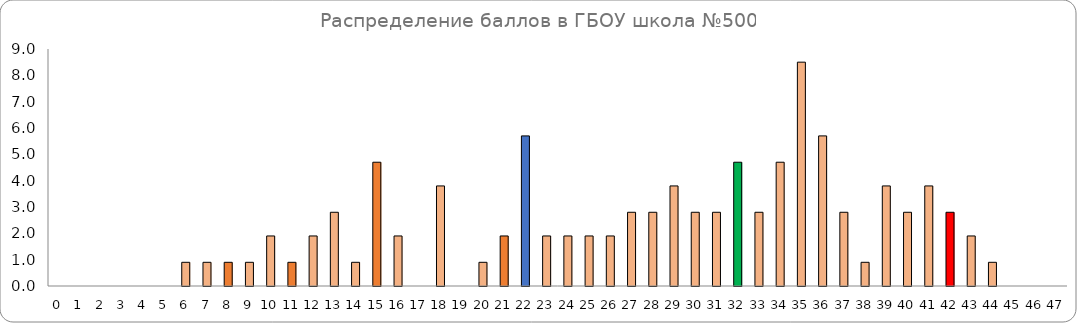
| Category | Series 0 |
|---|---|
| 0.0 | 0 |
| 1.0 | 0 |
| 2.0 | 0 |
| 3.0 | 0 |
| 4.0 | 0 |
| 5.0 | 0 |
| 6.0 | 0.9 |
| 7.0 | 0.9 |
| 8.0 | 0.9 |
| 9.0 | 0.9 |
| 10.0 | 1.9 |
| 11.0 | 0.9 |
| 12.0 | 1.9 |
| 13.0 | 2.8 |
| 14.0 | 0.9 |
| 15.0 | 4.7 |
| 16.0 | 1.9 |
| 17.0 | 0 |
| 18.0 | 3.8 |
| 19.0 | 0 |
| 20.0 | 0.9 |
| 21.0 | 1.9 |
| 22.0 | 5.7 |
| 23.0 | 1.9 |
| 24.0 | 1.9 |
| 25.0 | 1.9 |
| 26.0 | 1.9 |
| 27.0 | 2.8 |
| 28.0 | 2.8 |
| 29.0 | 3.8 |
| 30.0 | 2.8 |
| 31.0 | 2.8 |
| 32.0 | 4.7 |
| 33.0 | 2.8 |
| 34.0 | 4.7 |
| 35.0 | 8.5 |
| 36.0 | 5.7 |
| 37.0 | 2.8 |
| 38.0 | 0.9 |
| 39.0 | 3.8 |
| 40.0 | 2.8 |
| 41.0 | 3.8 |
| 42.0 | 2.8 |
| 43.0 | 1.9 |
| 44.0 | 0.9 |
| 45.0 | 0 |
| 46.0 | 0 |
| 47.0 | 0 |